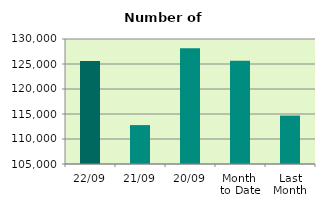
| Category | Series 0 |
|---|---|
| 22/09 | 125612 |
| 21/09 | 112780 |
| 20/09 | 128150 |
| Month 
to Date | 125656.375 |
| Last
Month | 114688 |